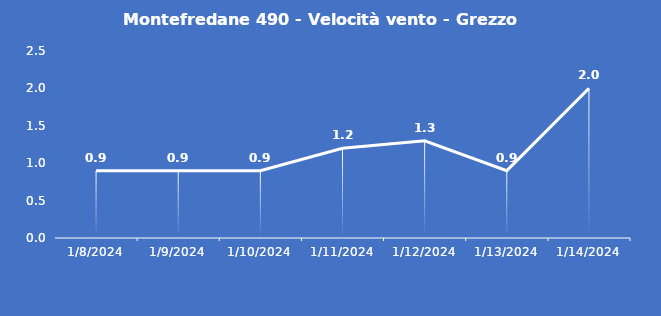
| Category | Montefredane 490 - Velocità vento - Grezzo (m/s) |
|---|---|
| 1/8/24 | 0.9 |
| 1/9/24 | 0.9 |
| 1/10/24 | 0.9 |
| 1/11/24 | 1.2 |
| 1/12/24 | 1.3 |
| 1/13/24 | 0.9 |
| 1/14/24 | 2 |